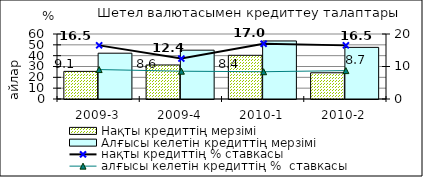
| Category | Нақты кредиттің мерзімі  | Алғысы келетін кредиттің мерзімі  |
|---|---|---|
| 2009-3 | 25.5 | 42.28 |
| 2009-4 | 31.4 | 45.06 |
| 2010-1 | 40.33 | 53.58 |
| 2010-2 | 24.2 | 47.66 |